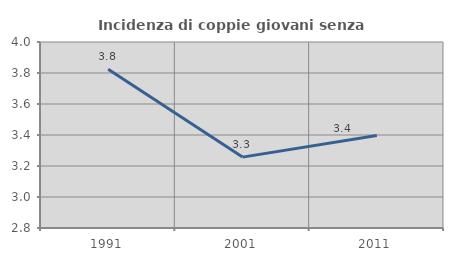
| Category | Incidenza di coppie giovani senza figli |
|---|---|
| 1991.0 | 3.824 |
| 2001.0 | 3.257 |
| 2011.0 | 3.396 |